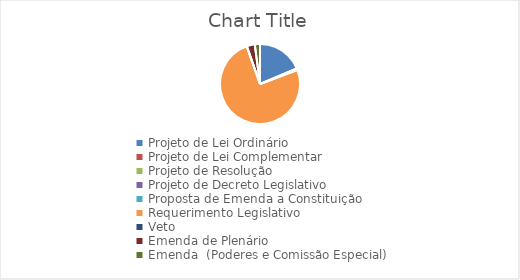
| Category | Series 0 | Series 1 |
|---|---|---|
| Projeto de Lei Ordinário | 346 |  |
| Projeto de Lei Complementar | 7 |  |
| Projeto de Resolução | 1 |  |
| Projeto de Decreto Legislativo | 3 |  |
| Proposta de Emenda a Constituição | 1 |  |
| Requerimento Legislativo | 1401 |  |
| Veto | 1 |  |
| Emenda de Plenário | 60 |  |
| Emenda  (Poderes e Comissão Especial) | 39 |  |